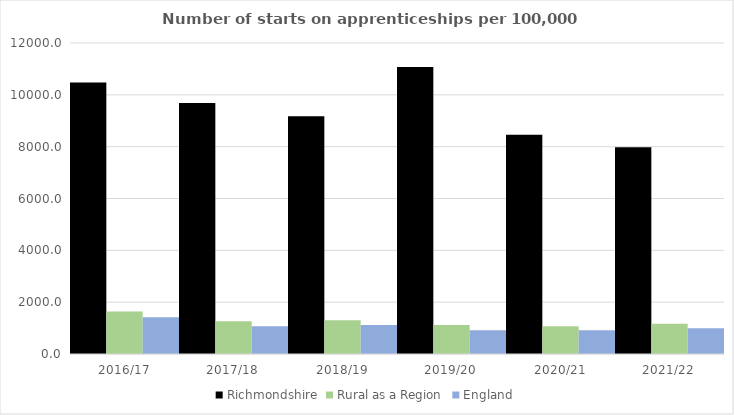
| Category | Richmondshire | Rural as a Region | England |
|---|---|---|---|
| 2016/17 | 10478 | 1638.789 | 1420 |
| 2017/18 | 9681 | 1267.474 | 1075 |
| 2018/19 | 9174 | 1304.57 | 1122 |
| 2019/20 | 11075 | 1119.662 | 918 |
| 2020/21 | 8456 | 1070.748 | 912 |
| 2021/22 | 7976 | 1167.68 | 991 |